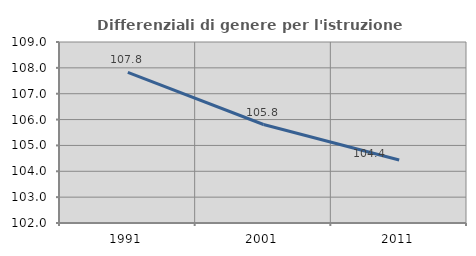
| Category | Differenziali di genere per l'istruzione superiore |
|---|---|
| 1991.0 | 107.825 |
| 2001.0 | 105.809 |
| 2011.0 | 104.434 |